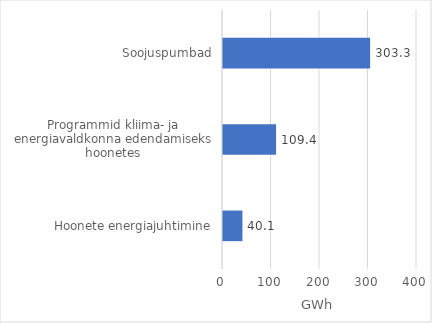
| Category | Series 0 |
|---|---|
| Hoonete energiajuhtimine | 40.086 |
| Programmid kliima- ja energiavaldkonna edendamiseks hoonetes | 109.372 |
| Soojuspumbad | 303.333 |